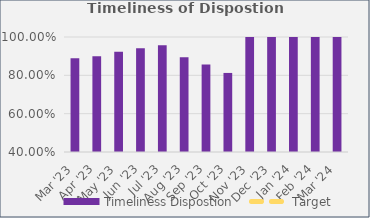
| Category | Timeliness Dispostion |
|---|---|
| Mar '23 | 0.889 |
| Apr '23 | 0.9 |
| May '23 | 0.923 |
| Jun '23 | 0.941 |
| Jul '23 | 0.957 |
| Aug '23 | 0.895 |
| Sep '23 | 0.857 |
| Oct '23 | 0.812 |
| Nov '23 | 1 |
| Dec '23 | 1 |
| Jan '24 | 1 |
| Feb '24 | 1 |
| Mar '24 | 1 |